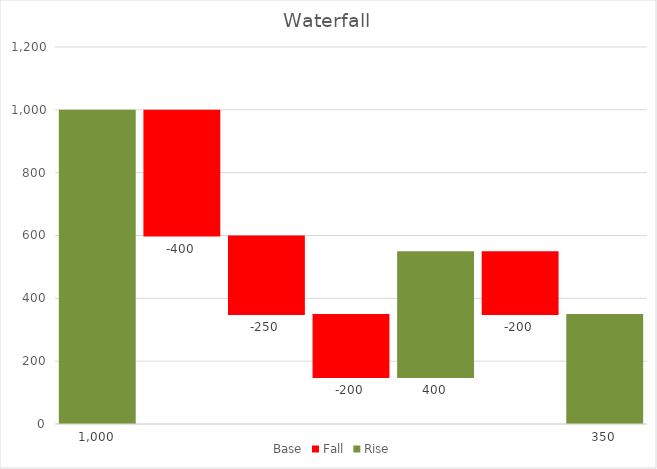
| Category | Base | Fall | Rise |
|---|---|---|---|
| GrossTurnover | 0 | 0 | 1000 |
| Returns | 600 | 400 | 0 |
| COS | 350 | 250 | 0 |
| W&S | 150 | 200 | 0 |
| OtherIncome | 150 | 0 | 400 |
| FixedCosts | 350 | 200 | 0 |
| Result | 0 | 0 | 350 |